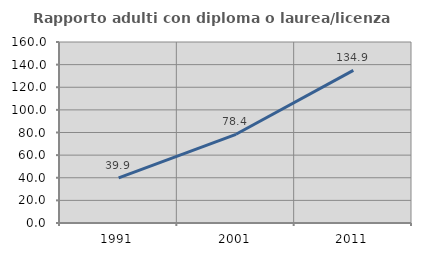
| Category | Rapporto adulti con diploma o laurea/licenza media  |
|---|---|
| 1991.0 | 39.875 |
| 2001.0 | 78.419 |
| 2011.0 | 134.899 |